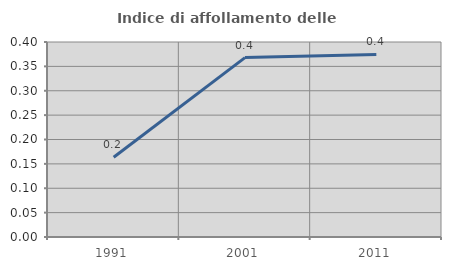
| Category | Indice di affollamento delle abitazioni  |
|---|---|
| 1991.0 | 0.163 |
| 2001.0 | 0.368 |
| 2011.0 | 0.374 |